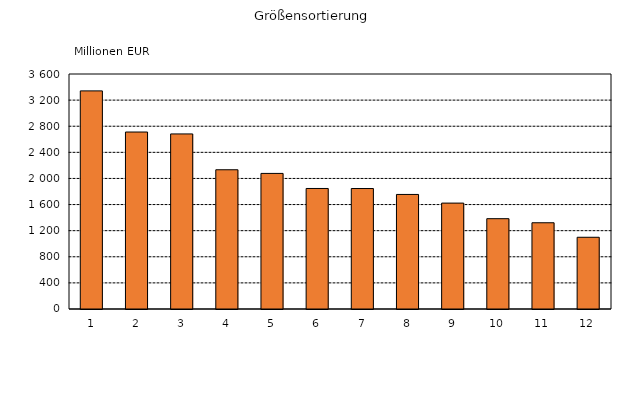
| Category | Series 0 |
|---|---|
| 1 | 3341.334 |
| 2 | 2711.026 |
| 3 | 2682.038 |
| 4 | 2133.08 |
| 5 | 2077.158 |
| 6 | 1846.285 |
| 7 | 1845.508 |
| 8 | 1754.817 |
| 9 | 1622.306 |
| 10 | 1383.705 |
| 11 | 1321.251 |
| 12 | 1098.831 |